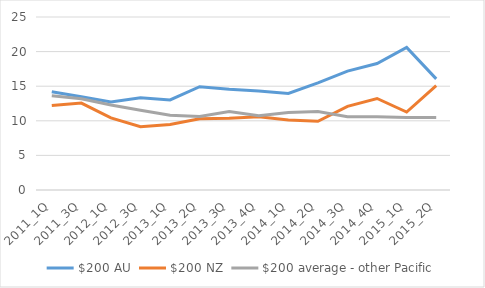
| Category | $200 AU | $200 NZ | $200 average - other Pacific |
|---|---|---|---|
| 2011_1Q | 14.203 | 12.226 | 13.633 |
| 2011_3Q | 13.475 | 12.554 | 13.183 |
| 2012_1Q | 12.708 | 10.416 | 12.284 |
| 2012_3Q | 13.336 | 9.148 | 11.526 |
| 2013_1Q | 13.02 | 9.452 | 10.794 |
| 2013_2Q | 14.926 | 10.309 | 10.631 |
| 2013_3Q | 14.557 | 10.362 | 11.339 |
| 2013_4Q | 14.304 | 10.592 | 10.719 |
| 2014_1Q | 13.943 | 10.123 | 11.215 |
| 2014_2Q | 15.483 | 9.922 | 11.338 |
| 2014_3Q | 17.18 | 12.085 | 10.597 |
| 2014_4Q | 18.278 | 13.223 | 10.589 |
| 2015_1Q | 20.609 | 11.259 | 10.465 |
| 2015_2Q | 16.058 | 15.096 | 10.477 |